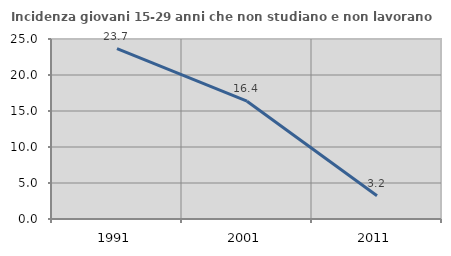
| Category | Incidenza giovani 15-29 anni che non studiano e non lavorano  |
|---|---|
| 1991.0 | 23.669 |
| 2001.0 | 16.364 |
| 2011.0 | 3.226 |